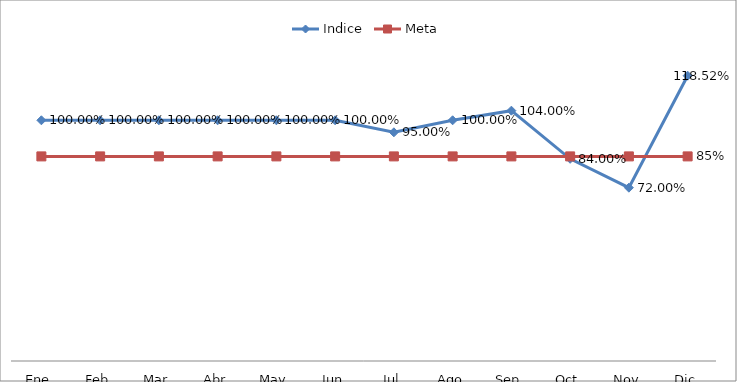
| Category | Indice | Meta |
|---|---|---|
| Ene | 1 | 0.85 |
| Feb | 1 | 0.85 |
| Mar | 1 | 0.85 |
| Abr | 1 | 0.85 |
| May | 1 | 0.85 |
| Jun | 1 | 0.85 |
| Jul | 0.95 | 0.85 |
| Ago | 1 | 0.85 |
| Sep | 1.04 | 0.85 |
| Oct | 0.84 | 0.85 |
| Nov | 0.72 | 0.85 |
| Dic | 1.185 | 0.85 |